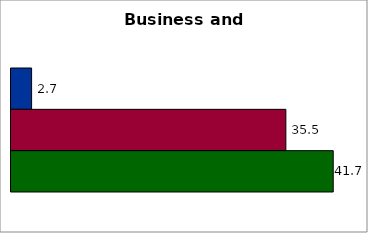
| Category | 50 states and D.C. | SREB states | State |
|---|---|---|---|
| 0 | 2.664 | 35.541 | 41.667 |